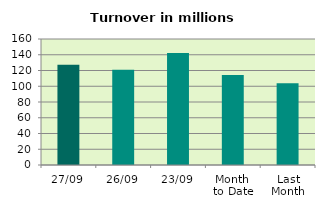
| Category | Series 0 |
|---|---|
| 27/09 | 127.296 |
| 26/09 | 121.005 |
| 23/09 | 142.129 |
| Month 
to Date | 114.212 |
| Last
Month | 103.765 |